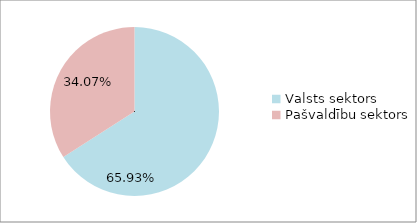
| Category | Series 0 |
|---|---|
| Valsts sektors | 0.659 |
| Pašvaldību sektors | 0.341 |